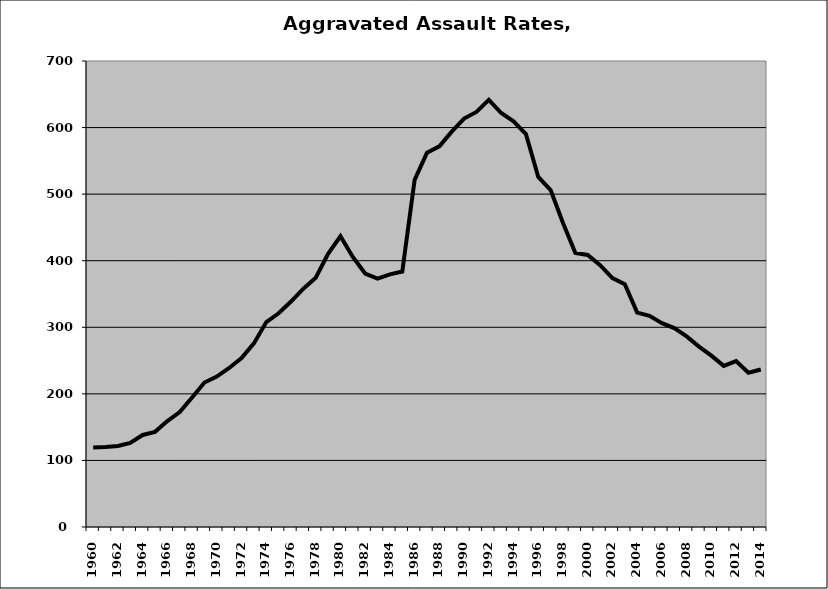
| Category | Aggravated Assault |
|---|---|
| 1960.0 | 119.589 |
| 1961.0 | 120.046 |
| 1962.0 | 121.656 |
| 1963.0 | 126.254 |
| 1964.0 | 138.233 |
| 1965.0 | 142.893 |
| 1966.0 | 159.113 |
| 1967.0 | 172.694 |
| 1968.0 | 194.62 |
| 1969.0 | 217.04 |
| 1970.0 | 225.944 |
| 1971.0 | 238.857 |
| 1972.0 | 253.664 |
| 1973.0 | 275.778 |
| 1974.0 | 307.825 |
| 1975.0 | 320.977 |
| 1976.0 | 338.704 |
| 1977.0 | 358.011 |
| 1978.0 | 374.379 |
| 1979.0 | 410.332 |
| 1980.0 | 436.695 |
| 1981.0 | 405.625 |
| 1982.0 | 380.735 |
| 1983.0 | 373.135 |
| 1984.0 | 379.541 |
| 1985.0 | 383.785 |
| 1986.0 | 521.482 |
| 1987.0 | 562.372 |
| 1988.0 | 571.766 |
| 1989.0 | 593.817 |
| 1990.0 | 613.582 |
| 1991.0 | 623.529 |
| 1992.0 | 641.608 |
| 1993.0 | 621.842 |
| 1994.0 | 609.424 |
| 1995.0 | 590.262 |
| 1996.0 | 525.798 |
| 1997.0 | 506.217 |
| 1998.0 | 456.571 |
| 1999.0 | 411.741 |
| 2000.0 | 408.654 |
| 2001.0 | 393.31 |
| 2002.0 | 373.77 |
| 2003.0 | 364.834 |
| 2004.0 | 321.968 |
| 2005.0 | 317.145 |
| 2006.0 | 306.178 |
| 2007.0 | 298.767 |
| 2008.0 | 286.337 |
| 2009.0 | 270.973 |
| 2010.0 | 257.361 |
| 2011.0 | 242 |
| 2012.0 | 249.217 |
| 2013.0 | 231.657 |
| 2014.0 | 236.59 |